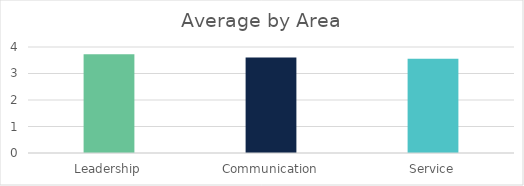
| Category | Series 0 |
|---|---|
| Leadership | 3.73 |
| Communication | 3.6 |
| Service | 3.56 |